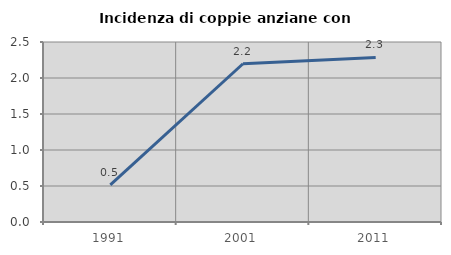
| Category | Incidenza di coppie anziane con figli |
|---|---|
| 1991.0 | 0.515 |
| 2001.0 | 2.198 |
| 2011.0 | 2.286 |